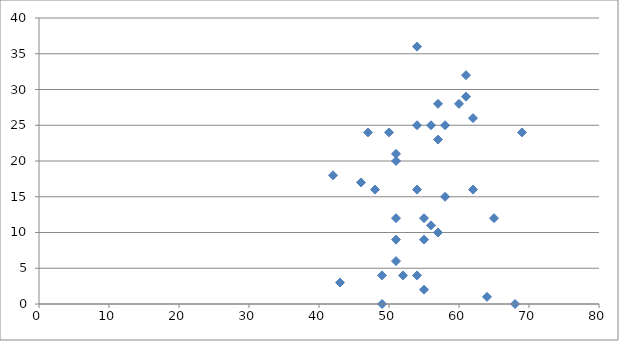
| Category | Series 0 |
|---|---|
| 57.0 | 10 |
| 61.0 | 29 |
| 58.0 | 25 |
| 57.0 | 28 |
| 58.0 | 15 |
| 57.0 | 23 |
| 62.0 | 26 |
| 54.0 | 25 |
| 68.0 | 0 |
| 51.0 | 20 |
| 49.0 | 4 |
| 64.0 | 1 |
| 50.0 | 24 |
| 48.0 | 16 |
| 65.0 | 12 |
| 52.0 | 4 |
| 57.0 | 10 |
| 46.0 | 17 |
| 54.0 | 16 |
| 49.0 | 0 |
| 51.0 | 6 |
| 47.0 | 24 |
| 55.0 | 12 |
| 54.0 | 4 |
| 42.0 | 18 |
| 51.0 | 21 |
| 56.0 | 11 |
| 55.0 | 2 |
| 51.0 | 9 |
| 54.0 | 36 |
| 51.0 | 12 |
| 60.0 | 28 |
| 62.0 | 16 |
| 43.0 | 3 |
| 55.0 | 9 |
| 56.0 | 25 |
| 61.0 | 32 |
| 69.0 | 24 |